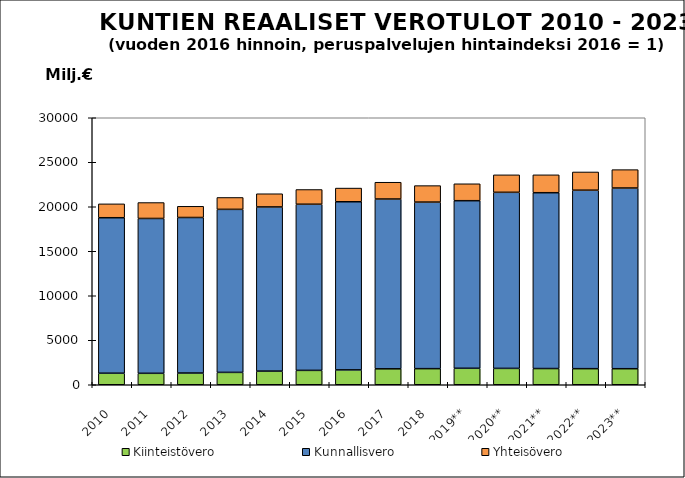
| Category | Kiinteistövero | Kunnallisvero | Yhteisövero |
|---|---|---|---|
| 2010 | 1296.352 | 17470.608 | 1559.108 |
| 2011 | 1285.841 | 17398.198 | 1789.548 |
| 2012 | 1317.524 | 17476.044 | 1257.689 |
| 2013 | 1389.588 | 18317.532 | 1337.058 |
| 2014 | 1532.817 | 18447.864 | 1481.581 |
| 2015 | 1616.418 | 18667.185 | 1654.236 |
| 2016 | 1669.703 | 18890.563 | 1537.872 |
| 2017 | 1790.628 | 19079.061 | 1886.129 |
| 2018 | 1809.209 | 18714.38 | 1852.755 |
| 2019** | 1851.566 | 18829.154 | 1900.549 |
| 2020** | 1839.395 | 19783.078 | 1963.937 |
| 2021** | 1822.317 | 19754.289 | 2010.184 |
| 2022** | 1807.172 | 20054.074 | 2046.899 |
| 2023** | 1802.883 | 20302.82 | 2065.615 |